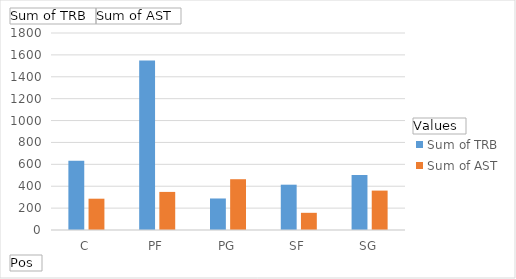
| Category | Sum of TRB | Sum of AST |
|---|---|---|
| C | 632 | 286 |
| PF | 1549 | 348 |
| PG | 288 | 464 |
| SF | 414 | 157 |
| SG | 503 | 360 |